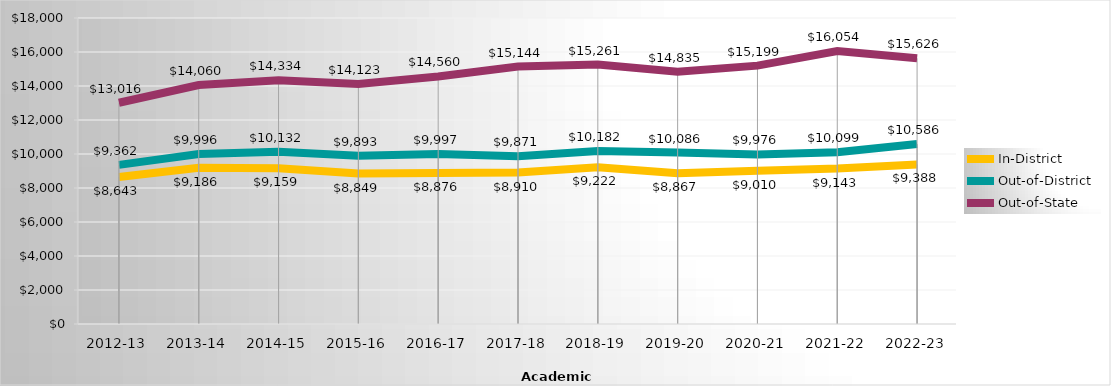
| Category | In-District | Out-of-District | Out-of-State |
|---|---|---|---|
| 2012-13 | 8643.15 | 9362 | 13016 |
| 2013-14 | 9185.83 | 9996.06 | 14060.13 |
| 2014-15 | 9159.04 | 10132.13 | 14333.65 |
| 2015-16 | 8849 | 9893 | 14123 |
| 2016-17 | 8876 | 9997 | 14560 |
| 2017-18 | 8910 | 9871 | 15144 |
| 2018-19 | 9222 | 10182 | 15261 |
| 2019-20 | 8867 | 10086 | 14835 |
| 2020-21 | 9010 | 9976 | 15199 |
| 2021-22 | 9143 | 10099 | 16054 |
| 2022-23 | 9388 | 10586 | 15626 |